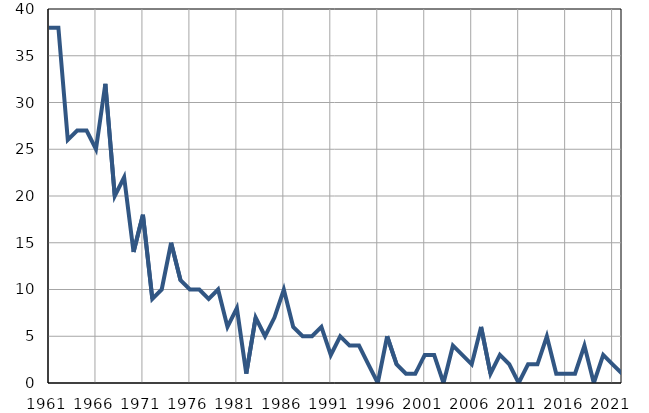
| Category | Умрла 
одојчад |
|---|---|
| 1961.0 | 38 |
| 1962.0 | 38 |
| 1963.0 | 26 |
| 1964.0 | 27 |
| 1965.0 | 27 |
| 1966.0 | 25 |
| 1967.0 | 32 |
| 1968.0 | 20 |
| 1969.0 | 22 |
| 1970.0 | 14 |
| 1971.0 | 18 |
| 1972.0 | 9 |
| 1973.0 | 10 |
| 1974.0 | 15 |
| 1975.0 | 11 |
| 1976.0 | 10 |
| 1977.0 | 10 |
| 1978.0 | 9 |
| 1979.0 | 10 |
| 1980.0 | 6 |
| 1981.0 | 8 |
| 1982.0 | 1 |
| 1983.0 | 7 |
| 1984.0 | 5 |
| 1985.0 | 7 |
| 1986.0 | 10 |
| 1987.0 | 6 |
| 1988.0 | 5 |
| 1989.0 | 5 |
| 1990.0 | 6 |
| 1991.0 | 3 |
| 1992.0 | 5 |
| 1993.0 | 4 |
| 1994.0 | 4 |
| 1995.0 | 2 |
| 1996.0 | 0 |
| 1997.0 | 5 |
| 1998.0 | 2 |
| 1999.0 | 1 |
| 2000.0 | 1 |
| 2001.0 | 3 |
| 2002.0 | 3 |
| 2003.0 | 0 |
| 2004.0 | 4 |
| 2005.0 | 3 |
| 2006.0 | 2 |
| 2007.0 | 6 |
| 2008.0 | 1 |
| 2009.0 | 3 |
| 2010.0 | 2 |
| 2011.0 | 0 |
| 2012.0 | 2 |
| 2013.0 | 2 |
| 2014.0 | 5 |
| 2015.0 | 1 |
| 2016.0 | 1 |
| 2017.0 | 1 |
| 2018.0 | 4 |
| 2019.0 | 0 |
| 2020.0 | 3 |
| 2021.0 | 2 |
| 2022.0 | 1 |